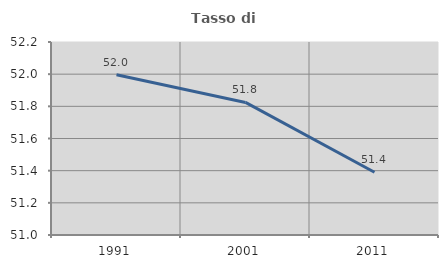
| Category | Tasso di occupazione   |
|---|---|
| 1991.0 | 51.996 |
| 2001.0 | 51.824 |
| 2011.0 | 51.39 |